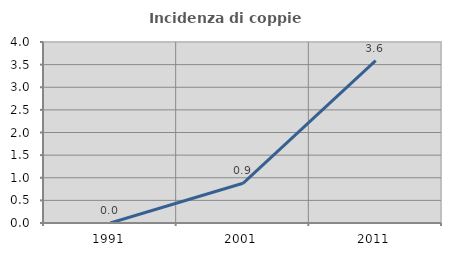
| Category | Incidenza di coppie miste |
|---|---|
| 1991.0 | 0 |
| 2001.0 | 0.877 |
| 2011.0 | 3.587 |